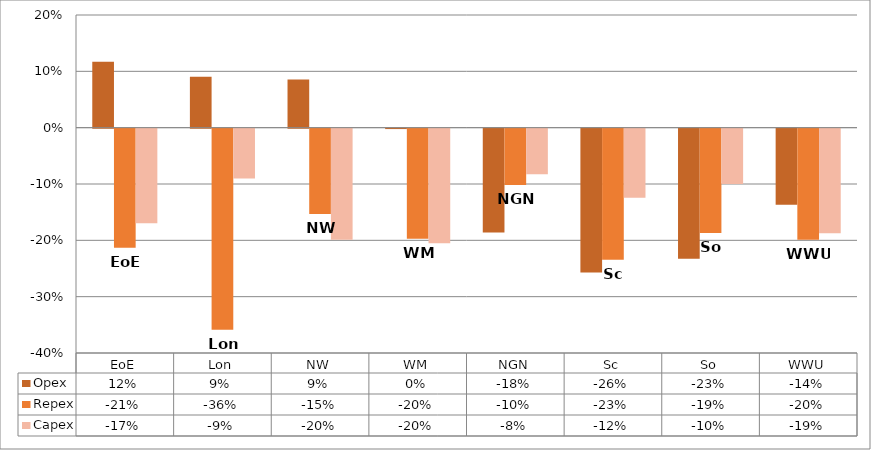
| Category | Opex | Repex | Capex |
|---|---|---|---|
| 0 | 0.117 | -0.211 | -0.168 |
| 1 | 0.09 | -0.357 | -0.089 |
| 2 | 0.085 | -0.151 | -0.197 |
| 3 | -0.001 | -0.196 | -0.203 |
| 4 | -0.184 | -0.1 | -0.081 |
| 5 | -0.255 | -0.233 | -0.123 |
| 6 | -0.231 | -0.185 | -0.098 |
| 7 | -0.135 | -0.197 | -0.186 |